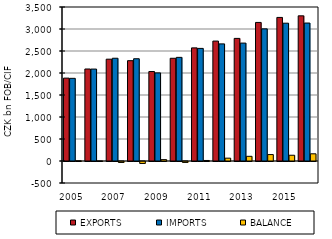
| Category | EXPORTS | IMPORTS | BALANCE |
|---|---|---|---|
| 2005.0 | 1883.79 | 1878.625 | 5.165 |
| 2006.0 | 2091.052 | 2089.252 | 1.8 |
| 2007.0 | 2314.157 | 2335.398 | -21.241 |
| 2008.0 | 2279.85 | 2324.182 | -44.332 |
| 2009.0 | 2033.354 | 2002.287 | 31.067 |
| 2010.0 | 2334.842 | 2355.421 | -20.579 |
| 2011.0 | 2570.941 | 2558.964 | 11.977 |
| 2012.0 | 2725.844 | 2661.432 | 64.412 |
| 2013.0 | 2786.229 | 2679.71 | 106.518 |
| 2014.0 | 3149.196 | 3003.188 | 146.008 |
| 2015.0 | 3262.971 | 3131.994 | 130.977 |
| 2016.0 | 3299.106 | 3135.452 | 163.654 |